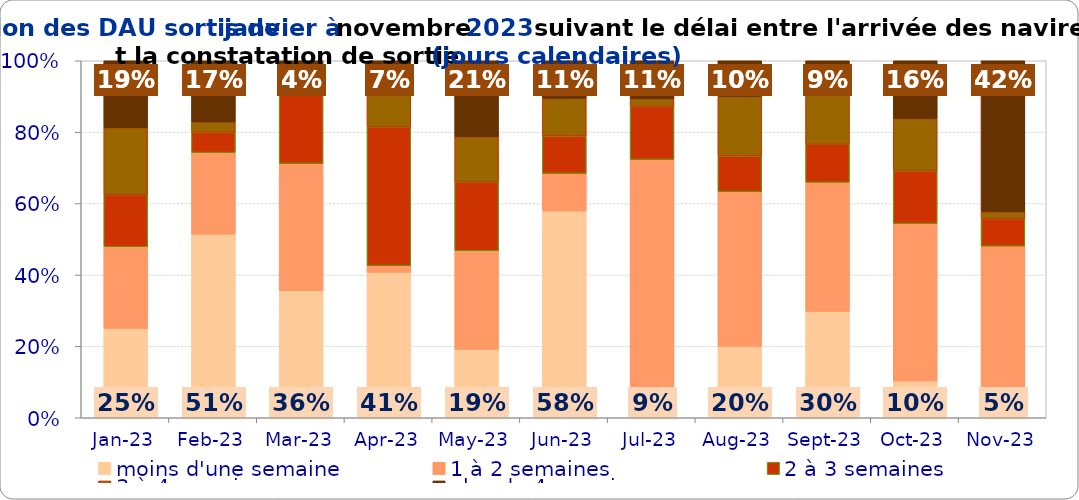
| Category | moins d'une semaine | 1 à 2 semaines | 2 à 3 semaines | 3 à 4 semaines | plus de 4 semaines |
|---|---|---|---|---|---|
| 2023-01-01 | 0.25 | 0.229 | 0.146 | 0.188 | 0.188 |
| 2023-02-01 | 0.514 | 0.229 | 0.057 | 0.029 | 0.171 |
| 2023-03-01 | 0.356 | 0.356 | 0.219 | 0.027 | 0.041 |
| 2023-04-01 | 0.407 | 0.019 | 0.389 | 0.111 | 0.074 |
| 2023-05-01 | 0.191 | 0.277 | 0.191 | 0.128 | 0.213 |
| 2023-06-01 | 0.579 | 0.105 | 0.105 | 0.105 | 0.105 |
| 2023-07-01 | 0.085 | 0.638 | 0.149 | 0.021 | 0.106 |
| 2023-08-01 | 0.2 | 0.433 | 0.1 | 0.167 | 0.1 |
| 2023-09-01 | 0.298 | 0.362 | 0.106 | 0.149 | 0.085 |
| 2023-10-01 | 0.103 | 0.441 | 0.147 | 0.147 | 0.162 |
| 2023-11-01 | 0.048 | 0.433 | 0.077 | 0.019 | 0.423 |